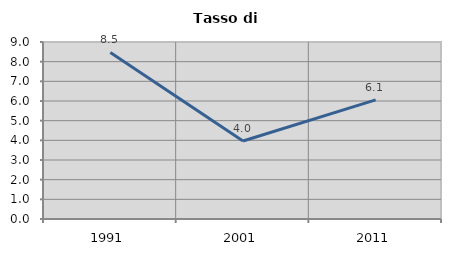
| Category | Tasso di disoccupazione   |
|---|---|
| 1991.0 | 8.469 |
| 2001.0 | 3.967 |
| 2011.0 | 6.056 |